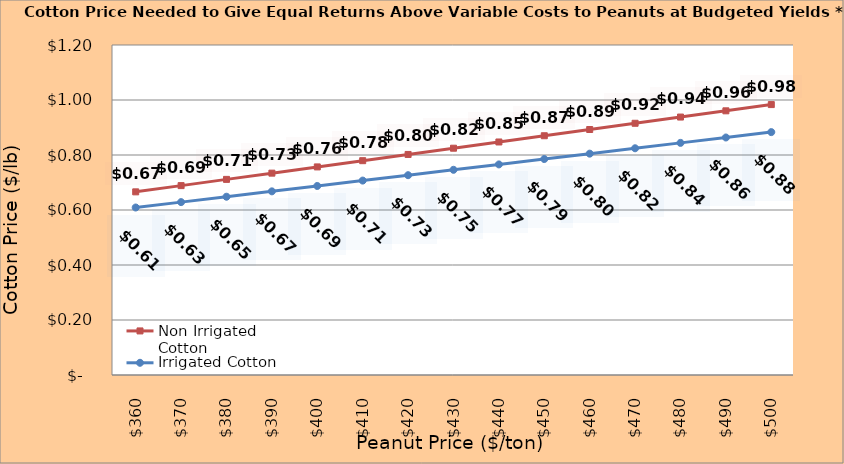
| Category | Non Irrigated Cotton | Irrigated Cotton |
|---|---|---|
| 360.0 | 0.666 | 0.609 |
| 370.0 | 0.689 | 0.629 |
| 380.0 | 0.711 | 0.648 |
| 390.0 | 0.734 | 0.668 |
| 400.0 | 0.757 | 0.687 |
| 410.0 | 0.779 | 0.707 |
| 420.0 | 0.802 | 0.727 |
| 430.0 | 0.825 | 0.746 |
| 440.0 | 0.847 | 0.766 |
| 450.0 | 0.87 | 0.785 |
| 460.0 | 0.893 | 0.805 |
| 470.0 | 0.915 | 0.824 |
| 480.0 | 0.938 | 0.844 |
| 490.0 | 0.961 | 0.864 |
| 500.0 | 0.983 | 0.883 |